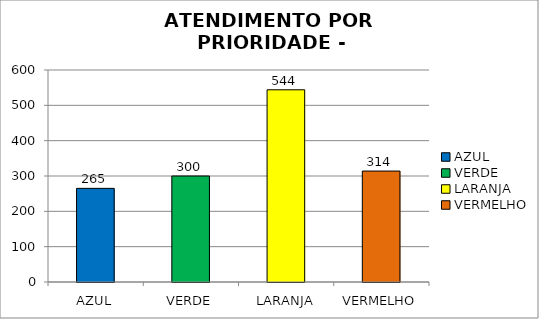
| Category | Total Regional: |
|---|---|
| AZUL | 265 |
| VERDE | 300 |
| LARANJA | 544 |
| VERMELHO | 314 |